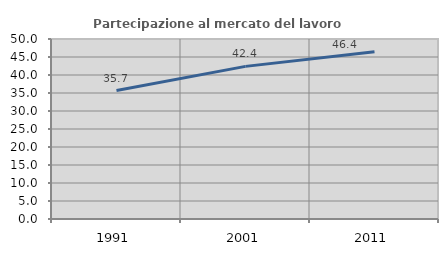
| Category | Partecipazione al mercato del lavoro  femminile |
|---|---|
| 1991.0 | 35.676 |
| 2001.0 | 42.398 |
| 2011.0 | 46.445 |